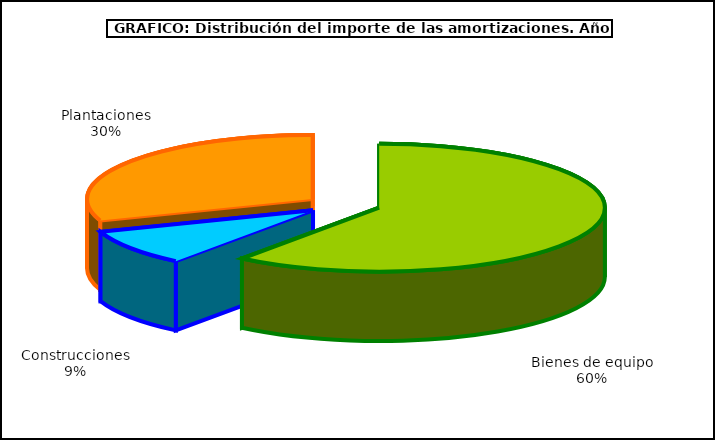
| Category | Series 0 |
|---|---|
| Bienes de equipo | 3215.265 |
| Construcciones | 486.149 |
| Plantaciones | 1621.474 |